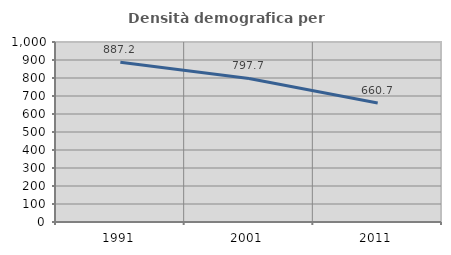
| Category | Densità demografica |
|---|---|
| 1991.0 | 887.233 |
| 2001.0 | 797.665 |
| 2011.0 | 660.744 |